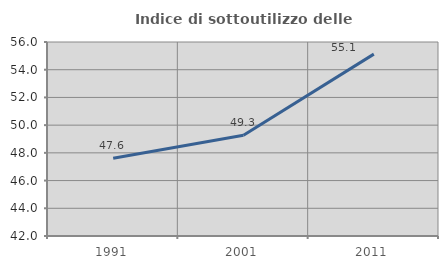
| Category | Indice di sottoutilizzo delle abitazioni  |
|---|---|
| 1991.0 | 47.61 |
| 2001.0 | 49.267 |
| 2011.0 | 55.124 |